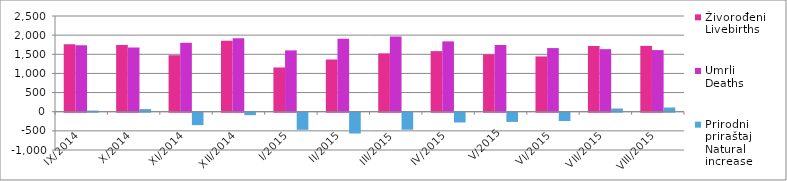
| Category | Živorođeni
Livebirths | Umrli
Deaths | Prirodni
priraštaj
Natural
increase |
|---|---|---|---|
| IX/2014 | 1763 | 1733 | 30 |
| X/2014 | 1744 | 1676 | 68 |
| XI/2014 | 1476 | 1800 | -324 |
| XII/2014 | 1854 | 1918 | -64 |
| I/2015 | 1156 | 1602 | -446 |
| II/2015 | 1364 | 1907 | -543 |
| III/2015 | 1523 | 1967 | -444 |
| IV/2015 | 1582 | 1837 | -255 |
| V/2015 | 1500 | 1740 | -240 |
| VI/2015 | 1444 | 1662 | -218 |
| VII/2015 | 1718 | 1634 | 84 |
| VIII/2015 | 1719 | 1609 | 110 |